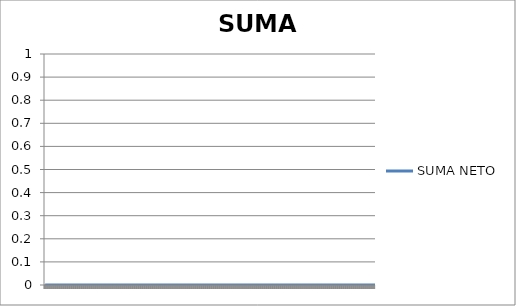
| Category | SUMA NETO |
|---|---|
|  | 0 |
|  | 0 |
|  | 0 |
|  | 0 |
|  | 0 |
|  | 0 |
|  | 0 |
|  | 0 |
|  | 0 |
|  | 0 |
|  | 0 |
|  | 0 |
|  | 0 |
|  | 0 |
|  | 0 |
|  | 0 |
|  | 0 |
|  | 0 |
|  | 0 |
|  | 0 |
|  | 0 |
|  | 0 |
|  | 0 |
|  | 0 |
|  | 0 |
|  | 0 |
|  | 0 |
|  | 0 |
|  | 0 |
|  | 0 |
|  | 0 |
|  | 0 |
|  | 0 |
|  | 0 |
|  | 0 |
|  | 0 |
|  | 0 |
|  | 0 |
|  | 0 |
|  | 0 |
|  | 0 |
|  | 0 |
|  | 0 |
|  | 0 |
|  | 0 |
|  | 0 |
|  | 0 |
|  | 0 |
|  | 0 |
|  | 0 |
|  | 0 |
|  | 0 |
|  | 0 |
|  | 0 |
|  | 0 |
|  | 0 |
|  | 0 |
|  | 0 |
|  | 0 |
|  | 0 |
|  | 0 |
|  | 0 |
|  | 0 |
|  | 0 |
|  | 0 |
|  | 0 |
|  | 0 |
|  | 0 |
|  | 0 |
|  | 0 |
|  | 0 |
|  | 0 |
|  | 0 |
|  | 0 |
|  | 0 |
|  | 0 |
|  | 0 |
|  | 0 |
|  | 0 |
|  | 0 |
|  | 0 |
|  | 0 |
|  | 0 |
|  | 0 |
|  | 0 |
|  | 0 |
|  | 0 |
|  | 0 |
|  | 0 |
|  | 0 |
|  | 0 |
|  | 0 |
|  | 0 |
|  | 0 |
|  | 0 |
|  | 0 |
|  | 0 |
|  | 0 |
|  | 0 |
|  | 0 |
|  | 0 |
|  | 0 |
|  | 0 |
|  | 0 |
|  | 0 |
|  | 0 |
|  | 0 |
|  | 0 |
|  | 0 |
|  | 0 |
|  | 0 |
|  | 0 |
|  | 0 |
|  | 0 |
|  | 0 |
|  | 0 |
|  | 0 |
|  | 0 |
|  | 0 |
|  | 0 |
|  | 0 |
|  | 0 |
|  | 0 |
|  | 0 |
|  | 0 |
|  | 0 |
|  | 0 |
|  | 0 |
|  | 0 |
|  | 0 |
|  | 0 |
|  | 0 |
|  | 0 |
|  | 0 |
|  | 0 |
|  | 0 |
|  | 0 |
|  | 0 |
|  | 0 |
|  | 0 |
|  | 0 |
|  | 0 |
|  | 0 |
|  | 0 |
|  | 0 |
|  | 0 |
|  | 0 |
|  | 0 |
|  | 0 |
|  | 0 |
|  | 0 |
|  | 0 |
|  | 0 |
|  | 0 |
|  | 0 |
|  | 0 |
|  | 0 |
|  | 0 |
|  | 0 |
|  | 0 |
|  | 0 |
|  | 0 |
|  | 0 |
|  | 0 |
|  | 0 |
|  | 0 |
|  | 0 |
|  | 0 |
|  | 0 |
|  | 0 |
|  | 0 |
|  | 0 |
|  | 0 |
|  | 0 |
|  | 0 |
|  | 0 |
|  | 0 |
|  | 0 |
|  | 0 |
|  | 0 |
|  | 0 |
|  | 0 |
|  | 0 |
|  | 0 |
|  | 0 |
|  | 0 |
|  | 0 |
|  | 0 |
|  | 0 |
|  | 0 |
|  | 0 |
|  | 0 |
|  | 0 |
|  | 0 |
|  | 0 |
|  | 0 |
|  | 0 |
|  | 0 |
|  | 0 |
|  | 0 |
|  | 0 |
|  | 0 |
|  | 0 |
|  | 0 |
|  | 0 |
|  | 0 |
|  | 0 |
|  | 0 |
|  | 0 |
|  | 0 |
|  | 0 |
|  | 0 |
|  | 0 |
|  | 0 |
|  | 0 |
|  | 0 |
|  | 0 |
|  | 0 |
|  | 0 |
|  | 0 |
|  | 0 |
|  | 0 |
|  | 0 |
|  | 0 |
|  | 0 |
|  | 0 |
|  | 0 |
|  | 0 |
|  | 0 |
|  | 0 |
|  | 0 |
|  | 0 |
|  | 0 |
|  | 0 |
|  | 0 |
|  | 0 |
|  | 0 |
|  | 0 |
|  | 0 |
|  | 0 |
|  | 0 |
|  | 0 |
|  | 0 |
|  | 0 |
|  | 0 |
|  | 0 |
|  | 0 |
|  | 0 |
|  | 0 |
|  | 0 |
|  | 0 |
|  | 0 |
|  | 0 |
|  | 0 |
|  | 0 |
|  | 0 |
|  | 0 |
|  | 0 |
|  | 0 |
|  | 0 |
|  | 0 |
|  | 0 |
|  | 0 |
|  | 0 |
|  | 0 |
|  | 0 |
|  | 0 |
|  | 0 |
|  | 0 |
|  | 0 |
|  | 0 |
|  | 0 |
|  | 0 |
|  | 0 |
|  | 0 |
|  | 0 |
|  | 0 |
|  | 0 |
|  | 0 |
|  | 0 |
|  | 0 |
|  | 0 |
|  | 0 |
|  | 0 |
|  | 0 |
|  | 0 |
|  | 0 |
|  | 0 |
|  | 0 |
|  | 0 |
|  | 0 |
|  | 0 |
|  | 0 |
|  | 0 |
|  | 0 |
|  | 0 |
|  | 0 |
|  | 0 |
|  | 0 |
|  | 0 |
|  | 0 |
|  | 0 |
|  | 0 |
|  | 0 |
|  | 0 |
|  | 0 |
|  | 0 |
|  | 0 |
|  | 0 |
|  | 0 |
|  | 0 |
|  | 0 |
|  | 0 |
|  | 0 |
|  | 0 |
|  | 0 |
|  | 0 |
|  | 0 |
|  | 0 |
|  | 0 |
|  | 0 |
|  | 0 |
|  | 0 |
|  | 0 |
|  | 0 |
|  | 0 |
|  | 0 |
|  | 0 |
|  | 0 |
|  | 0 |
|  | 0 |
|  | 0 |
|  | 0 |
|  | 0 |
|  | 0 |
|  | 0 |
|  | 0 |
|  | 0 |
|  | 0 |
|  | 0 |
|  | 0 |
|  | 0 |
|  | 0 |
|  | 0 |
|  | 0 |
|  | 0 |
|  | 0 |
|  | 0 |
|  | 0 |
|  | 0 |
|  | 0 |
|  | 0 |
|  | 0 |
|  | 0 |
|  | 0 |
|  | 0 |
|  | 0 |
|  | 0 |
|  | 0 |
|  | 0 |
|  | 0 |
|  | 0 |
|  | 0 |
|  | 0 |
|  | 0 |
|  | 0 |
|  | 0 |
|  | 0 |
|  | 0 |
|  | 0 |
|  | 0 |
|  | 0 |
|  | 0 |
|  | 0 |
|  | 0 |
|  | 0 |
|  | 0 |
|  | 0 |
|  | 0 |
|  | 0 |
|  | 0 |
|  | 0 |
|  | 0 |
|  | 0 |
|  | 0 |
|  | 0 |
|  | 0 |
|  | 0 |
|  | 0 |
|  | 0 |
|  | 0 |
|  | 0 |
|  | 0 |
|  | 0 |
|  | 0 |
|  | 0 |
|  | 0 |
|  | 0 |
|  | 0 |
|  | 0 |
|  | 0 |
|  | 0 |
|  | 0 |
|  | 0 |
|  | 0 |
|  | 0 |
|  | 0 |
|  | 0 |
|  | 0 |
|  | 0 |
|  | 0 |
|  | 0 |
|  | 0 |
|  | 0 |
|  | 0 |
|  | 0 |
|  | 0 |
|  | 0 |
|  | 0 |
|  | 0 |
|  | 0 |
|  | 0 |
|  | 0 |
|  | 0 |
|  | 0 |
|  | 0 |
|  | 0 |
|  | 0 |
|  | 0 |
|  | 0 |
|  | 0 |
|  | 0 |
|  | 0 |
|  | 0 |
|  | 0 |
|  | 0 |
|  | 0 |
|  | 0 |
|  | 0 |
|  | 0 |
|  | 0 |
|  | 0 |
|  | 0 |
|  | 0 |
|  | 0 |
|  | 0 |
|  | 0 |
|  | 0 |
|  | 0 |
|  | 0 |
|  | 0 |
|  | 0 |
|  | 0 |
|  | 0 |
|  | 0 |
|  | 0 |
|  | 0 |
|  | 0 |
|  | 0 |
|  | 0 |
|  | 0 |
|  | 0 |
|  | 0 |
|  | 0 |
|  | 0 |
|  | 0 |
|  | 0 |
|  | 0 |
|  | 0 |
|  | 0 |
|  | 0 |
|  | 0 |
|  | 0 |
|  | 0 |
|  | 0 |
|  | 0 |
|  | 0 |
|  | 0 |
|  | 0 |
|  | 0 |
|  | 0 |
|  | 0 |
|  | 0 |
|  | 0 |
|  | 0 |
|  | 0 |
|  | 0 |
|  | 0 |
|  | 0 |
|  | 0 |
|  | 0 |
|  | 0 |
|  | 0 |
|  | 0 |
|  | 0 |
|  | 0 |
|  | 0 |
|  | 0 |
|  | 0 |
|  | 0 |
|  | 0 |
|  | 0 |
|  | 0 |
|  | 0 |
|  | 0 |
|  | 0 |
|  | 0 |
|  | 0 |
|  | 0 |
|  | 0 |
|  | 0 |
|  | 0 |
|  | 0 |
|  | 0 |
|  | 0 |
|  | 0 |
|  | 0 |
|  | 0 |
|  | 0 |
|  | 0 |
|  | 0 |
|  | 0 |
|  | 0 |
|  | 0 |
|  | 0 |
|  | 0 |
|  | 0 |
|  | 0 |
|  | 0 |
|  | 0 |
|  | 0 |
|  | 0 |
|  | 0 |
|  | 0 |
|  | 0 |
|  | 0 |
|  | 0 |
|  | 0 |
|  | 0 |
|  | 0 |
|  | 0 |
|  | 0 |
|  | 0 |
|  | 0 |
|  | 0 |
|  | 0 |
|  | 0 |
|  | 0 |
|  | 0 |
|  | 0 |
|  | 0 |
|  | 0 |
|  | 0 |
|  | 0 |
|  | 0 |
|  | 0 |
|  | 0 |
|  | 0 |
|  | 0 |
|  | 0 |
|  | 0 |
|  | 0 |
|  | 0 |
|  | 0 |
|  | 0 |
|  | 0 |
|  | 0 |
|  | 0 |
|  | 0 |
|  | 0 |
|  | 0 |
|  | 0 |
|  | 0 |
|  | 0 |
|  | 0 |
|  | 0 |
|  | 0 |
|  | 0 |
|  | 0 |
|  | 0 |
|  | 0 |
|  | 0 |
|  | 0 |
|  | 0 |
|  | 0 |
|  | 0 |
|  | 0 |
|  | 0 |
|  | 0 |
|  | 0 |
|  | 0 |
|  | 0 |
|  | 0 |
|  | 0 |
|  | 0 |
|  | 0 |
|  | 0 |
|  | 0 |
|  | 0 |
|  | 0 |
|  | 0 |
|  | 0 |
|  | 0 |
|  | 0 |
|  | 0 |
|  | 0 |
|  | 0 |
|  | 0 |
|  | 0 |
|  | 0 |
|  | 0 |
|  | 0 |
|  | 0 |
|  | 0 |
|  | 0 |
|  | 0 |
|  | 0 |
|  | 0 |
|  | 0 |
|  | 0 |
|  | 0 |
|  | 0 |
|  | 0 |
|  | 0 |
|  | 0 |
|  | 0 |
|  | 0 |
|  | 0 |
|  | 0 |
|  | 0 |
|  | 0 |
|  | 0 |
|  | 0 |
|  | 0 |
|  | 0 |
|  | 0 |
|  | 0 |
|  | 0 |
|  | 0 |
|  | 0 |
|  | 0 |
|  | 0 |
|  | 0 |
|  | 0 |
|  | 0 |
|  | 0 |
|  | 0 |
|  | 0 |
|  | 0 |
|  | 0 |
|  | 0 |
|  | 0 |
|  | 0 |
|  | 0 |
|  | 0 |
|  | 0 |
|  | 0 |
|  | 0 |
|  | 0 |
|  | 0 |
|  | 0 |
|  | 0 |
|  | 0 |
|  | 0 |
|  | 0 |
|  | 0 |
|  | 0 |
|  | 0 |
|  | 0 |
|  | 0 |
|  | 0 |
|  | 0 |
|  | 0 |
|  | 0 |
|  | 0 |
|  | 0 |
|  | 0 |
|  | 0 |
|  | 0 |
|  | 0 |
|  | 0 |
|  | 0 |
|  | 0 |
|  | 0 |
|  | 0 |
|  | 0 |
|  | 0 |
|  | 0 |
|  | 0 |
|  | 0 |
|  | 0 |
|  | 0 |
|  | 0 |
|  | 0 |
|  | 0 |
|  | 0 |
|  | 0 |
|  | 0 |
|  | 0 |
|  | 0 |
|  | 0 |
|  | 0 |
|  | 0 |
|  | 0 |
|  | 0 |
|  | 0 |
|  | 0 |
|  | 0 |
|  | 0 |
|  | 0 |
|  | 0 |
|  | 0 |
|  | 0 |
|  | 0 |
|  | 0 |
|  | 0 |
|  | 0 |
|  | 0 |
|  | 0 |
|  | 0 |
|  | 0 |
|  | 0 |
|  | 0 |
|  | 0 |
|  | 0 |
|  | 0 |
|  | 0 |
|  | 0 |
|  | 0 |
|  | 0 |
|  | 0 |
|  | 0 |
|  | 0 |
|  | 0 |
|  | 0 |
|  | 0 |
|  | 0 |
|  | 0 |
|  | 0 |
|  | 0 |
|  | 0 |
|  | 0 |
|  | 0 |
|  | 0 |
|  | 0 |
|  | 0 |
|  | 0 |
|  | 0 |
|  | 0 |
|  | 0 |
|  | 0 |
|  | 0 |
|  | 0 |
|  | 0 |
|  | 0 |
|  | 0 |
|  | 0 |
|  | 0 |
|  | 0 |
|  | 0 |
|  | 0 |
|  | 0 |
|  | 0 |
|  | 0 |
|  | 0 |
|  | 0 |
|  | 0 |
|  | 0 |
|  | 0 |
|  | 0 |
|  | 0 |
|  | 0 |
|  | 0 |
|  | 0 |
|  | 0 |
|  | 0 |
|  | 0 |
|  | 0 |
|  | 0 |
|  | 0 |
|  | 0 |
|  | 0 |
|  | 0 |
|  | 0 |
|  | 0 |
|  | 0 |
|  | 0 |
|  | 0 |
|  | 0 |
|  | 0 |
|  | 0 |
|  | 0 |
|  | 0 |
|  | 0 |
|  | 0 |
|  | 0 |
|  | 0 |
|  | 0 |
|  | 0 |
|  | 0 |
|  | 0 |
|  | 0 |
|  | 0 |
|  | 0 |
|  | 0 |
|  | 0 |
|  | 0 |
|  | 0 |
|  | 0 |
|  | 0 |
|  | 0 |
|  | 0 |
|  | 0 |
|  | 0 |
|  | 0 |
|  | 0 |
|  | 0 |
|  | 0 |
|  | 0 |
|  | 0 |
|  | 0 |
|  | 0 |
|  | 0 |
|  | 0 |
|  | 0 |
|  | 0 |
|  | 0 |
|  | 0 |
|  | 0 |
|  | 0 |
|  | 0 |
|  | 0 |
|  | 0 |
|  | 0 |
|  | 0 |
|  | 0 |
|  | 0 |
|  | 0 |
|  | 0 |
|  | 0 |
|  | 0 |
|  | 0 |
|  | 0 |
|  | 0 |
|  | 0 |
|  | 0 |
|  | 0 |
|  | 0 |
|  | 0 |
|  | 0 |
|  | 0 |
|  | 0 |
|  | 0 |
|  | 0 |
|  | 0 |
|  | 0 |
|  | 0 |
|  | 0 |
|  | 0 |
|  | 0 |
|  | 0 |
|  | 0 |
|  | 0 |
|  | 0 |
|  | 0 |
|  | 0 |
|  | 0 |
|  | 0 |
|  | 0 |
|  | 0 |
|  | 0 |
|  | 0 |
|  | 0 |
|  | 0 |
|  | 0 |
|  | 0 |
|  | 0 |
|  | 0 |
|  | 0 |
|  | 0 |
|  | 0 |
|  | 0 |
|  | 0 |
|  | 0 |
|  | 0 |
|  | 0 |
|  | 0 |
|  | 0 |
|  | 0 |
|  | 0 |
|  | 0 |
|  | 0 |
|  | 0 |
|  | 0 |
|  | 0 |
|  | 0 |
|  | 0 |
|  | 0 |
|  | 0 |
|  | 0 |
|  | 0 |
|  | 0 |
|  | 0 |
|  | 0 |
|  | 0 |
|  | 0 |
|  | 0 |
|  | 0 |
|  | 0 |
|  | 0 |
|  | 0 |
|  | 0 |
|  | 0 |
|  | 0 |
|  | 0 |
|  | 0 |
|  | 0 |
|  | 0 |
|  | 0 |
|  | 0 |
|  | 0 |
|  | 0 |
|  | 0 |
|  | 0 |
|  | 0 |
|  | 0 |
|  | 0 |
|  | 0 |
|  | 0 |
|  | 0 |
|  | 0 |
|  | 0 |
|  | 0 |
|  | 0 |
|  | 0 |
|  | 0 |
|  | 0 |
|  | 0 |
|  | 0 |
|  | 0 |
|  | 0 |
|  | 0 |
|  | 0 |
|  | 0 |
|  | 0 |
|  | 0 |
|  | 0 |
|  | 0 |
|  | 0 |
|  | 0 |
|  | 0 |
|  | 0 |
|  | 0 |
|  | 0 |
|  | 0 |
|  | 0 |
|  | 0 |
|  | 0 |
|  | 0 |
|  | 0 |
|  | 0 |
|  | 0 |
|  | 0 |
|  | 0 |
|  | 0 |
|  | 0 |
|  | 0 |
|  | 0 |
|  | 0 |
|  | 0 |
|  | 0 |
|  | 0 |
|  | 0 |
|  | 0 |
|  | 0 |
|  | 0 |
|  | 0 |
|  | 0 |
|  | 0 |
|  | 0 |
|  | 0 |
|  | 0 |
|  | 0 |
|  | 0 |
|  | 0 |
|  | 0 |
|  | 0 |
|  | 0 |
|  | 0 |
|  | 0 |
|  | 0 |
|  | 0 |
|  | 0 |
|  | 0 |
|  | 0 |
|  | 0 |
|  | 0 |
|  | 0 |